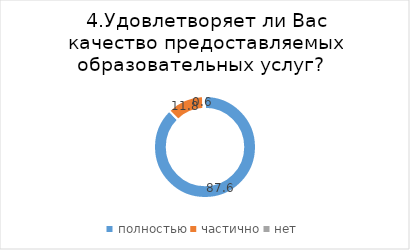
| Category | Series 0 |
|---|---|
| полностью | 87.603 |
| частично | 11.777 |
| нет | 0.62 |